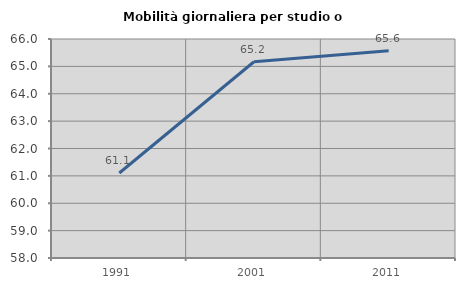
| Category | Mobilità giornaliera per studio o lavoro |
|---|---|
| 1991.0 | 61.104 |
| 2001.0 | 65.168 |
| 2011.0 | 65.568 |